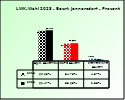
| Category | 2018 | 2023 |
|---|---|---|
| Bgld. Bauernbund | 0.607 | 0.615 |
| SPÖ Bauern | 0.348 | 0.357 |
| Freiheitliche Bauern | 0.046 | 0.029 |